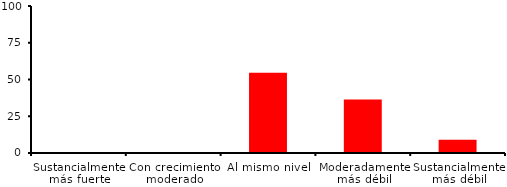
| Category | Series 0 |
|---|---|
| Sustancialmente más fuerte | 0 |
| Con crecimiento moderado | 0 |
| Al mismo nivel | 54.545 |
| Moderadamente más débil | 36.364 |
| Sustancialmente más débil | 9.091 |